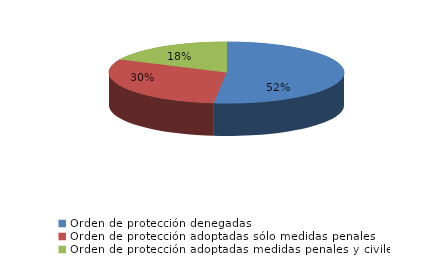
| Category | Series 0 |
|---|---|
| Orden de protección denegadas | 270 |
| Orden de protección adoptadas sólo medidas penales | 158 |
| Orden de protección adoptadas medidas penales y civiles | 94 |